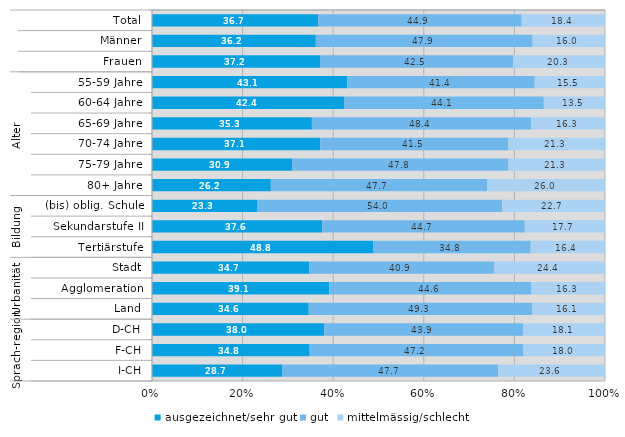
| Category | ausgezeichnet/sehr gut | gut | mittelmässig/schlecht |
|---|---|---|---|
| 0 | 36.7 | 44.9 | 18.4 |
| 1 | 36.2 | 47.9 | 16 |
| 2 | 37.2 | 42.5 | 20.3 |
| 3 | 43.1 | 41.4 | 15.5 |
| 4 | 42.4 | 44.1 | 13.5 |
| 5 | 35.3 | 48.4 | 16.3 |
| 6 | 37.1 | 41.5 | 21.3 |
| 7 | 30.9 | 47.8 | 21.3 |
| 8 | 26.2 | 47.7 | 26 |
| 9 | 23.3 | 54 | 22.7 |
| 10 | 37.6 | 44.7 | 17.7 |
| 11 | 48.8 | 34.8 | 16.4 |
| 12 | 34.7 | 40.9 | 24.4 |
| 13 | 39.1 | 44.6 | 16.3 |
| 14 | 34.6 | 49.3 | 16.1 |
| 15 | 38 | 43.9 | 18.1 |
| 16 | 34.8 | 47.2 | 18 |
| 17 | 28.7 | 47.7 | 23.6 |